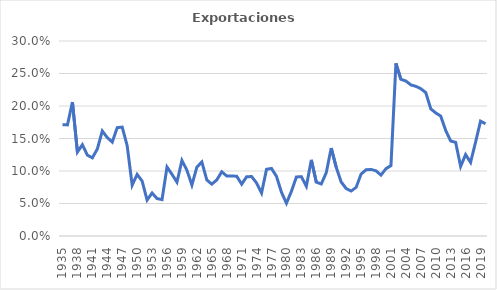
| Category | Exportaciones |
|---|---|
| 1935.0 | 0.171 |
| 1936.0 | 0.171 |
| 1937.0 | 0.206 |
| 1938.0 | 0.129 |
| 1939.0 | 0.14 |
| 1940.0 | 0.124 |
| 1941.0 | 0.12 |
| 1942.0 | 0.134 |
| 1943.0 | 0.162 |
| 1944.0 | 0.151 |
| 1945.0 | 0.145 |
| 1946.0 | 0.167 |
| 1947.0 | 0.168 |
| 1948.0 | 0.139 |
| 1949.0 | 0.078 |
| 1950.0 | 0.095 |
| 1951.0 | 0.085 |
| 1952.0 | 0.055 |
| 1953.0 | 0.066 |
| 1954.0 | 0.058 |
| 1955.0 | 0.056 |
| 1956.0 | 0.106 |
| 1957.0 | 0.095 |
| 1958.0 | 0.083 |
| 1959.0 | 0.116 |
| 1960.0 | 0.101 |
| 1961.0 | 0.078 |
| 1962.0 | 0.106 |
| 1963.0 | 0.114 |
| 1964.0 | 0.086 |
| 1965.0 | 0.08 |
| 1966.0 | 0.086 |
| 1967.0 | 0.099 |
| 1968.0 | 0.092 |
| 1969.0 | 0.092 |
| 1970.0 | 0.092 |
| 1971.0 | 0.08 |
| 1972.0 | 0.091 |
| 1973.0 | 0.091 |
| 1974.0 | 0.082 |
| 1975.0 | 0.066 |
| 1976.0 | 0.103 |
| 1977.0 | 0.104 |
| 1978.0 | 0.092 |
| 1979.0 | 0.067 |
| 1980.0 | 0.05 |
| 1981.0 | 0.069 |
| 1982.0 | 0.091 |
| 1983.0 | 0.091 |
| 1984.0 | 0.076 |
| 1985.0 | 0.117 |
| 1986.0 | 0.083 |
| 1987.0 | 0.08 |
| 1988.0 | 0.097 |
| 1989.0 | 0.135 |
| 1990.0 | 0.106 |
| 1991.0 | 0.083 |
| 1992.0 | 0.073 |
| 1993.0 | 0.069 |
| 1994.0 | 0.075 |
| 1995.0 | 0.095 |
| 1996.0 | 0.102 |
| 1997.0 | 0.102 |
| 1998.0 | 0.1 |
| 1999.0 | 0.094 |
| 2000.0 | 0.104 |
| 2001.0 | 0.108 |
| 2002.0 | 0.266 |
| 2003.0 | 0.241 |
| 2004.0 | 0.238 |
| 2005.0 | 0.232 |
| 2006.0 | 0.23 |
| 2007.0 | 0.227 |
| 2008.0 | 0.221 |
| 2009.0 | 0.196 |
| 2010.0 | 0.189 |
| 2011.0 | 0.184 |
| 2012.0 | 0.162 |
| 2013.0 | 0.146 |
| 2014.0 | 0.144 |
| 2015.0 | 0.107 |
| 2016.0 | 0.125 |
| 2017.0 | 0.113 |
| 2018.0 | 0.144 |
| 2019.0 | 0.177 |
| 2020.0 | 0.173 |